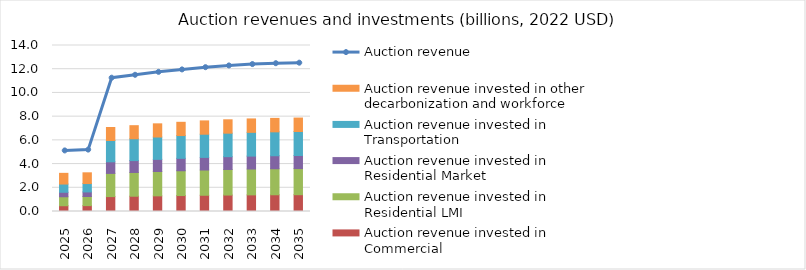
| Category | Auction revenue invested in Commercial | Auction revenue invested in Residential LMI | Auction revenue invested in Residential Market | Auction revenue invested in Transportation | Auction revenue invested in other decarbonization and workforce |
|---|---|---|---|---|---|
| 2025.0 | 0.486 | 0.756 | 0.378 | 0.695 | 0.902 |
| 2026.0 | 0.495 | 0.77 | 0.385 | 0.707 | 0.904 |
| 2027.0 | 1.257 | 1.956 | 0.978 | 1.796 | 1.095 |
| 2028.0 | 1.288 | 2.004 | 1.002 | 1.84 | 1.103 |
| 2029.0 | 1.319 | 2.052 | 1.026 | 1.885 | 1.111 |
| 2030.0 | 1.345 | 2.092 | 1.046 | 1.922 | 1.117 |
| 2031.0 | 1.369 | 2.129 | 1.065 | 1.955 | 1.123 |
| 2032.0 | 1.387 | 2.158 | 1.079 | 1.982 | 1.128 |
| 2033.0 | 1.402 | 2.18 | 1.09 | 2.003 | 1.132 |
| 2034.0 | 1.411 | 2.195 | 1.097 | 2.016 | 1.134 |
| 2035.0 | 1.417 | 2.203 | 1.102 | 2.024 | 1.135 |